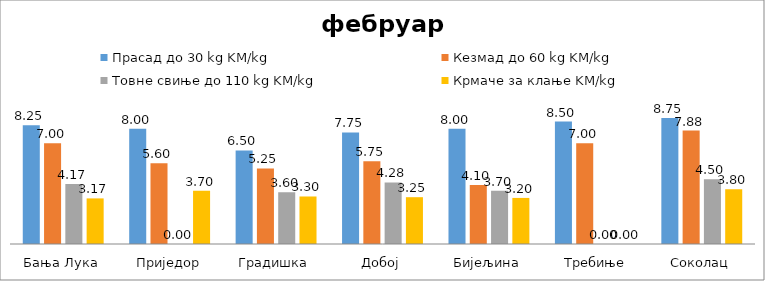
| Category | Прасад до 30 kg KM/kg | Кезмад до 60 kg KM/kg | Товне свиње до 110 kg KM/kg | Крмаче за клање KM/kg |
|---|---|---|---|---|
| Бања Лука | 8.25 | 7 | 4.167 | 3.167 |
| Приједор | 8 | 5.6 | 0 | 3.7 |
| Градишка | 6.5 | 5.25 | 3.6 | 3.3 |
| Добој | 7.75 | 5.75 | 4.275 | 3.25 |
| Бијељина | 8 | 4.1 | 3.7 | 3.2 |
|  Требиње | 8.5 | 7 | 0 | 0 |
| Соколац | 8.75 | 7.875 | 4.5 | 3.8 |